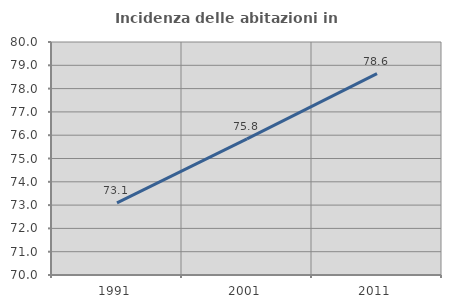
| Category | Incidenza delle abitazioni in proprietà  |
|---|---|
| 1991.0 | 73.093 |
| 2001.0 | 75.841 |
| 2011.0 | 78.642 |